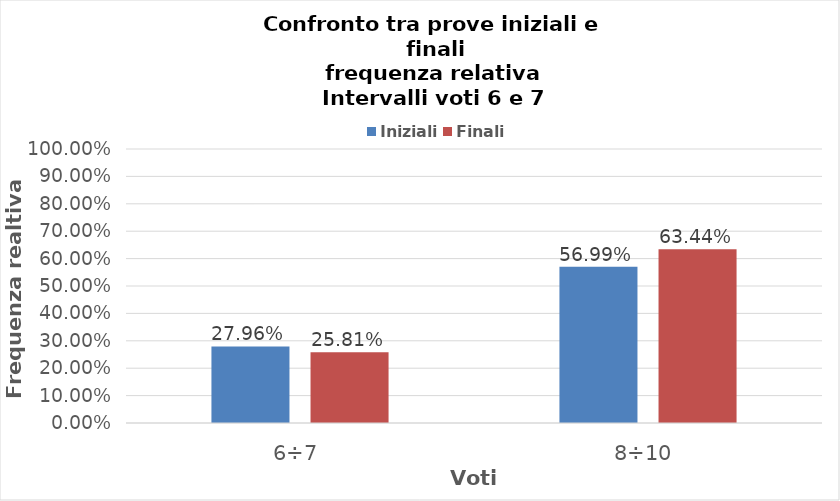
| Category | Iniziali | Finali |
|---|---|---|
| 6÷7 | 0.28 | 0.258 |
| 8÷10 | 0.57 | 0.634 |